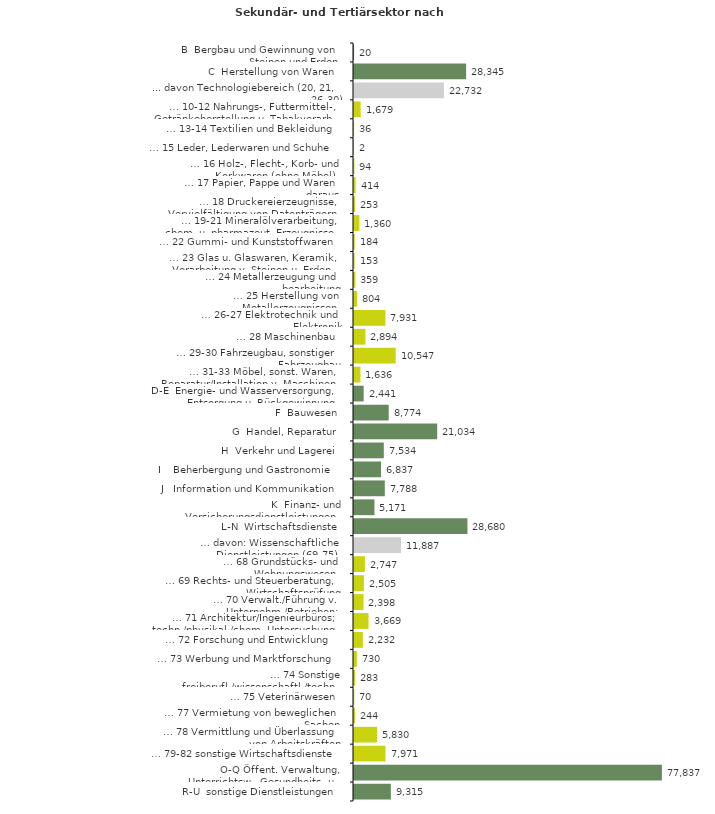
| Category | Series 0 |
|---|---|
| B  Bergbau und Gewinnung von Steinen und Erden | 20 |
| C  Herstellung von Waren | 28345 |
| ... davon Technologiebereich (20, 21, 26-30) | 22732 |
| … 10-12 Nahrungs-, Futtermittel-, Getränkeherstellung u. Tabakverarb. | 1679 |
| … 13-14 Textilien und Bekleidung | 36 |
| … 15 Leder, Lederwaren und Schuhe | 2 |
| … 16 Holz-, Flecht-, Korb- und Korkwaren (ohne Möbel)  | 94 |
| … 17 Papier, Pappe und Waren daraus  | 414 |
| … 18 Druckereierzeugnisse, Vervielfältigung von Datenträgern | 253 |
| … 19-21 Mineralölverarbeitung, chem. u. pharmazeut. Erzeugnisse | 1360 |
| … 22 Gummi- und Kunststoffwaren | 184 |
| … 23 Glas u. Glaswaren, Keramik, Verarbeitung v. Steinen u. Erden  | 153 |
| … 24 Metallerzeugung und -bearbeitung | 359 |
| … 25 Herstellung von Metallerzeugnissen  | 804 |
| … 26-27 Elektrotechnik und Elektronik | 7931 |
| … 28 Maschinenbau | 2894 |
| … 29-30 Fahrzeugbau, sonstiger Fahrzeugbau | 10547 |
| … 31-33 Möbel, sonst. Waren, Reparatur/Installation v. Maschinen | 1636 |
| D-E  Energie- und Wasserversorgung, Entsorgung u. Rückgewinnung | 2441 |
| F  Bauwesen | 8774 |
| G  Handel, Reparatur | 21034 |
| H  Verkehr und Lagerei | 7534 |
| I    Beherbergung und Gastronomie | 6837 |
| J   Information und Kommunikation | 7788 |
| K  Finanz- und Versicherungsdienstleistungen | 5171 |
| L-N  Wirtschaftsdienste | 28680 |
| … davon: Wissenschaftliche Dienstleistungen (69-75) | 11887 |
| … 68 Grundstücks- und Wohnungswesen  | 2747 |
| … 69 Rechts- und Steuerberatung, Wirtschaftsprüfung | 2505 |
| … 70 Verwalt./Führung v. Unternehm./Betrieben; Unternehmensberat. | 2398 |
| … 71 Architektur/Ingenieurbüros; techn./physikal./chem. Untersuchung | 3669 |
| … 72 Forschung und Entwicklung  | 2232 |
| … 73 Werbung und Marktforschung | 730 |
| … 74 Sonstige freiberufl./wissenschaftl./techn. Tätigkeiten | 283 |
| … 75 Veterinärwesen | 70 |
| … 77 Vermietung von beweglichen Sachen  | 244 |
| … 78 Vermittlung und Überlassung von Arbeitskräften | 5830 |
| … 79-82 sonstige Wirtschaftsdienste | 7971 |
| O-Q Öffent. Verwaltung, Unterrichtsw., Gesundheits- u. Sozialwesen | 77837 |
| R-U  sonstige Dienstleistungen | 9315 |